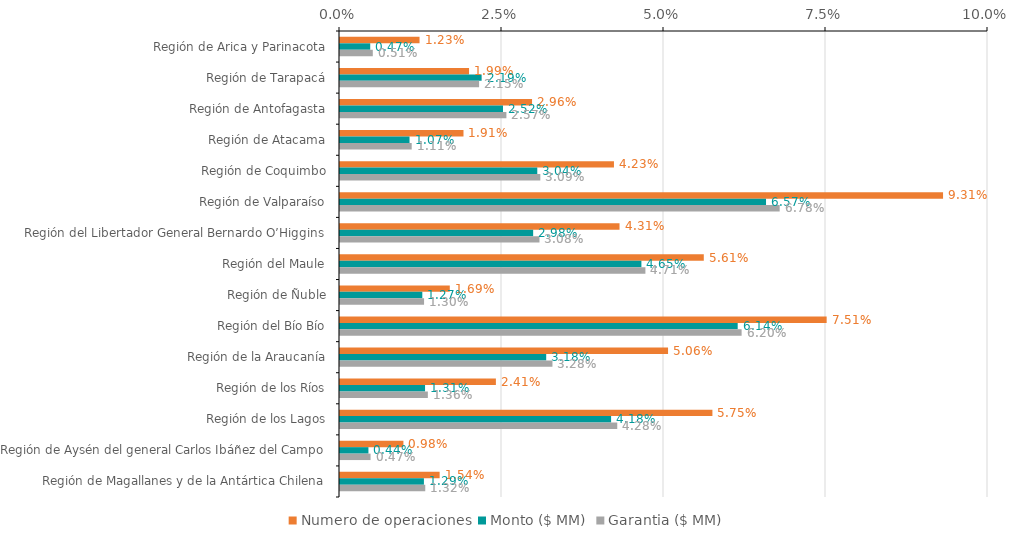
| Category | Numero de operaciones | Monto ($ MM) | Garantia ($ MM) |
|---|---|---|---|
| Región de Arica y Parinacota | 0.012 | 0.005 | 0.005 |
| Región de Tarapacá | 0.02 | 0.022 | 0.021 |
| Región de Antofagasta | 0.03 | 0.025 | 0.026 |
| Región de Atacama | 0.019 | 0.011 | 0.011 |
| Región de Coquimbo | 0.042 | 0.03 | 0.031 |
| Región de Valparaíso | 0.093 | 0.066 | 0.068 |
| Región del Libertador General Bernardo O’Higgins | 0.043 | 0.03 | 0.031 |
| Región del Maule | 0.056 | 0.047 | 0.047 |
| Región de Ñuble | 0.017 | 0.013 | 0.013 |
| Región del Bío Bío | 0.075 | 0.061 | 0.062 |
| Región de la Araucanía | 0.051 | 0.032 | 0.033 |
| Región de los Ríos | 0.024 | 0.013 | 0.014 |
| Región de los Lagos | 0.057 | 0.042 | 0.043 |
| Región de Aysén del general Carlos Ibáñez del Campo | 0.01 | 0.004 | 0.005 |
| Región de Magallanes y de la Antártica Chilena | 0.015 | 0.013 | 0.013 |